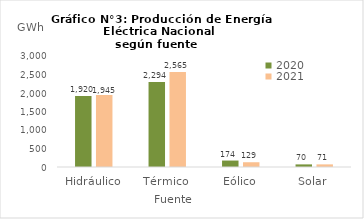
| Category | 2020 | 2021 |
|---|---|---|
| Hidráulico | 1919.752 | 1945.108 |
| Térmico | 2294.298 | 2565.435 |
| Eólico | 174.345 | 128.811 |
| Solar | 70.454 | 70.789 |